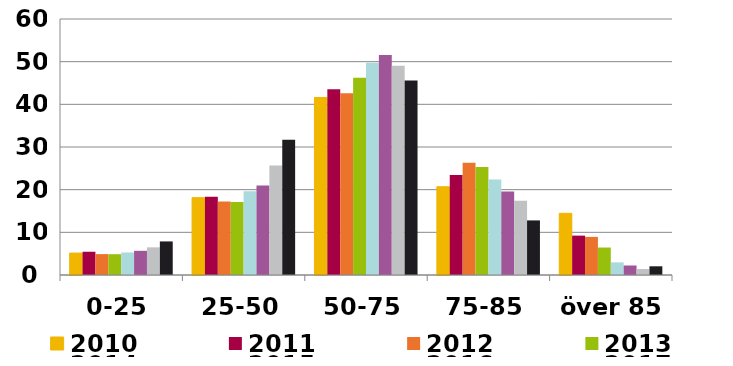
| Category | 2010 | 2011 | 2012 | 2013 | 2014 | 2015 | 2016 | 2017 |
|---|---|---|---|---|---|---|---|---|
| 0-25 | 5.14 | 5.448 | 4.896 | 4.874 | 5.278 | 5.666 | 6.483 | 7.869 |
| 25-50 | 18.126 | 18.361 | 17.256 | 17.128 | 19.62 | 20.985 | 25.645 | 31.72 |
| 50-75 | 41.597 | 43.534 | 42.599 | 46.226 | 49.74 | 51.577 | 49.064 | 45.575 |
| 75-85 | 20.683 | 23.429 | 26.319 | 25.336 | 22.406 | 19.541 | 17.413 | 12.795 |
| över 85 | 14.455 | 9.227 | 8.931 | 6.436 | 2.957 | 2.231 | 1.395 | 2.041 |